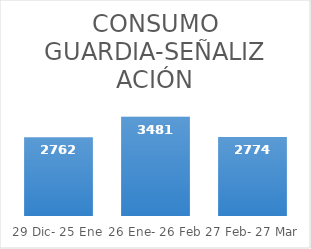
| Category | Series 0 |
|---|---|
| 29 Dic- 25 Ene | 2762 |
| 26 Ene- 26 Feb | 3481 |
| 27 Feb- 27 Mar | 2774 |